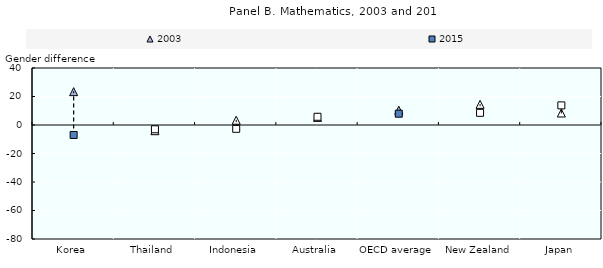
| Category | 2003 | 2015 |
|---|---|---|
| Korea | 23.406 | -6.99 |
| Thailand | -4 | -3 |
| Indonesia | 3.34 | -2.666 |
| Australia | 5.342 | 5.776 |
| OECD average | 10.363 | 7.938 |
| New Zealand | 14.482 | 8.549 |
| Japan | 8.42 | 13.771 |